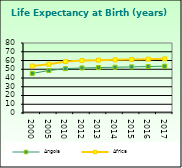
| Category | Angola | Africa                        |
|---|---|---|
| 2000.0 | 45.234 | 53.721 |
| 2005.0 | 48.572 | 55.757 |
| 2010.0 | 50.689 | 58.857 |
| 2012.0 | 51.498 | 59.91 |
| 2013.0 | 51.899 | 60.376 |
| 2014.0 | 52.3 | 60.801 |
| 2015.0 | 52.698 | 61.187 |
| 2016.0 | 53.093 | 61.538 |
| 2017.0 | 53.483 | 61.865 |